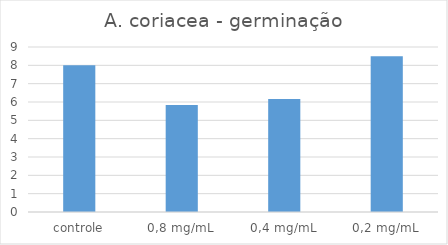
| Category | Series 0 |
|---|---|
| controle | 8 |
| 0,8 mg/mL | 5.833 |
| 0,4 mg/mL | 6.16 |
| 0,2 mg/mL | 8.5 |